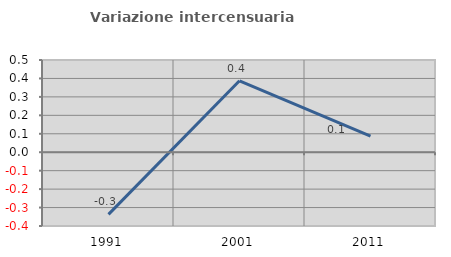
| Category | Variazione intercensuaria annua |
|---|---|
| 1991.0 | -0.337 |
| 2001.0 | 0.387 |
| 2011.0 | 0.087 |